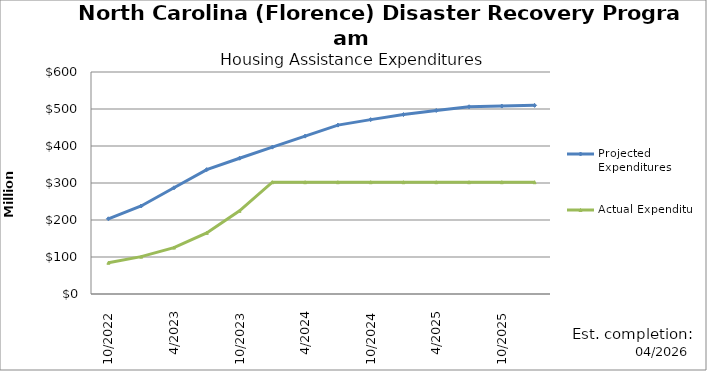
| Category | Projected Expenditures | Actual Expenditure |
|---|---|---|
| 10/2022 | 203220178 | 84420288.3 |
| 1/2023 | 237813733 | 100936743.25 |
| 4/2023 | 287019896 | 125438988.36 |
| 7/2023 | 336226060 | 165215608.73 |
| 10/2023 | 366986192 | 224875167.46 |
| 1/2024 | 396885984 | 302145075.41 |
| 4/2024 | 426646116 | 302145075.41 |
| 7/2024 | 456406248 | 302145075.41 |
| 10/2024 | 471243670 | 302145075.41 |
| 1/2025 | 484995804 | 302145075.41 |
| 4/2025 | 495961158 | 302145075.41 |
| 7/2025 | 506000072 | 302145075.41 |
| 10/2025 | 507899326 | 302145075.41 |
| 1/2026 | 509798580 | 302145075.41 |